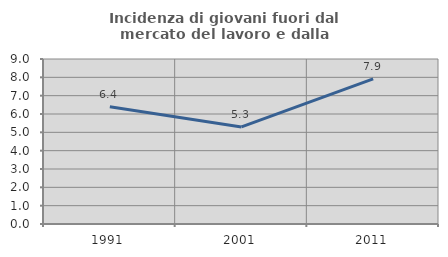
| Category | Incidenza di giovani fuori dal mercato del lavoro e dalla formazione  |
|---|---|
| 1991.0 | 6.395 |
| 2001.0 | 5.296 |
| 2011.0 | 7.914 |